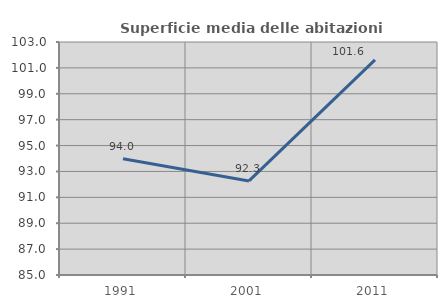
| Category | Superficie media delle abitazioni occupate |
|---|---|
| 1991.0 | 93.98 |
| 2001.0 | 92.267 |
| 2011.0 | 101.625 |